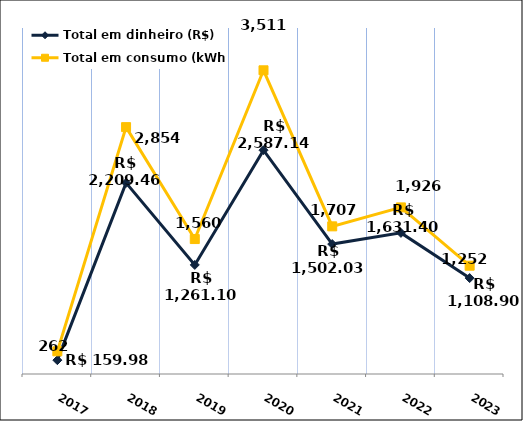
| Category | Total em dinheiro (R$) |
|---|---|
| 2017.0 | 159.98 |
| 2018.0 | 2209.46 |
| 2019.0 | 1261.1 |
| 2020.0 | 2587.14 |
| 2021.0 | 1502.03 |
| 2022.0 | 1631.4 |
| 2023.0 | 1108.9 |